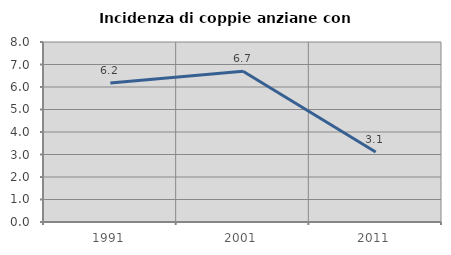
| Category | Incidenza di coppie anziane con figli |
|---|---|
| 1991.0 | 6.182 |
| 2001.0 | 6.696 |
| 2011.0 | 3.109 |